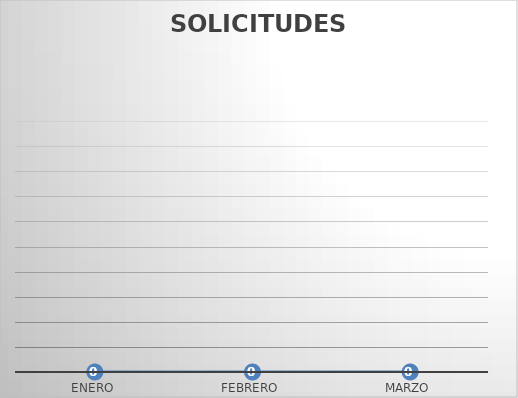
| Category | SOLICITUDES NEGADAS |
|---|---|
| ENERO | 0 |
| FEBRERO | 0 |
| MARZO | 0 |